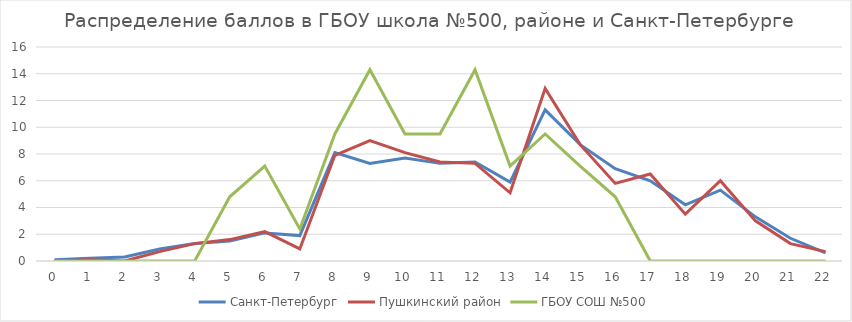
| Category | Санкт-Петербург | Пушкинский район | ГБОУ СОШ №500 |
|---|---|---|---|
| 0.0 | 0.1 | 0 | 0 |
| 1.0 | 0.2 | 0.1 | 0 |
| 2.0 | 0.3 | 0 | 0 |
| 3.0 | 0.9 | 0.7 | 0 |
| 4.0 | 1.3 | 1.3 | 0 |
| 5.0 | 1.5 | 1.6 | 4.8 |
| 6.0 | 2.1 | 2.2 | 7.1 |
| 7.0 | 1.9 | 0.9 | 2.4 |
| 8.0 | 8.1 | 7.9 | 9.5 |
| 9.0 | 7.3 | 9 | 14.3 |
| 10.0 | 7.7 | 8.1 | 9.5 |
| 11.0 | 7.3 | 7.4 | 9.5 |
| 12.0 | 7.4 | 7.3 | 14.3 |
| 13.0 | 5.9 | 5.1 | 7.1 |
| 14.0 | 11.3 | 12.9 | 9.5 |
| 15.0 | 8.7 | 8.7 | 7.1 |
| 16.0 | 6.9 | 5.8 | 4.8 |
| 17.0 | 6 | 6.5 | 0 |
| 18.0 | 4.2 | 3.5 | 0 |
| 19.0 | 5.3 | 6 | 0 |
| 20.0 | 3.3 | 3 | 0 |
| 21.0 | 1.7 | 1.3 | 0 |
| 22.0 | 0.6 | 0.7 | 0 |